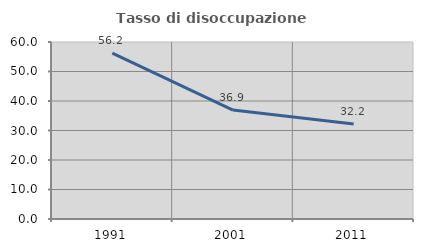
| Category | Tasso di disoccupazione giovanile  |
|---|---|
| 1991.0 | 56.209 |
| 2001.0 | 36.923 |
| 2011.0 | 32.203 |